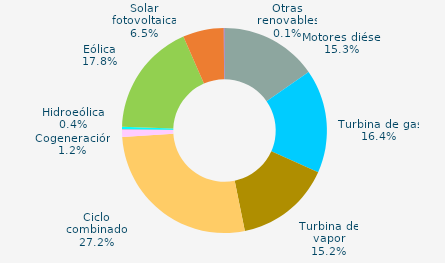
| Category | Series 0 |
|---|---|
| Motores diésel | 15.312 |
| Turbina de gas | 16.352 |
| Turbina de vapor | 15.155 |
| Ciclo combinado | 27.174 |
| Cogeneración | 1.199 |
| Hidráulica | 0.048 |
| Hidroeólica | 0.355 |
| Eólica | 17.833 |
| Solar fotovoltaica | 6.456 |
| Otras renovables | 0.116 |